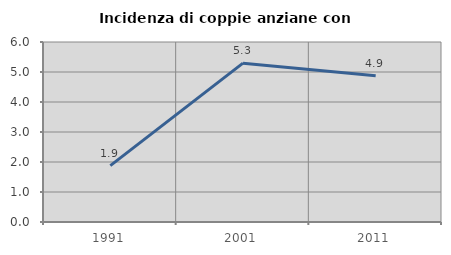
| Category | Incidenza di coppie anziane con figli |
|---|---|
| 1991.0 | 1.881 |
| 2001.0 | 5.294 |
| 2011.0 | 4.878 |